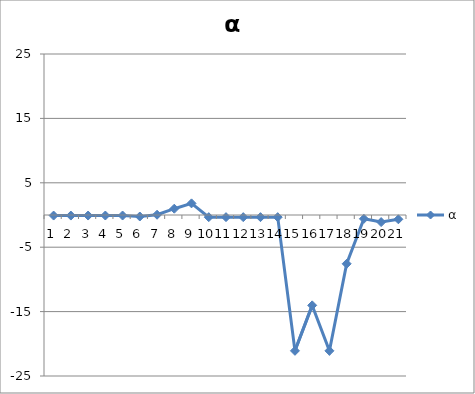
| Category | α |
|---|---|
| 0 | -0.087 |
| 1 | -0.088 |
| 2 | -0.083 |
| 3 | -0.082 |
| 4 | -0.082 |
| 5 | -0.235 |
| 6 | 0.041 |
| 7 | 0.977 |
| 8 | 1.807 |
| 9 | -0.333 |
| 10 | -0.333 |
| 11 | -0.333 |
| 12 | -0.333 |
| 13 | -0.333 |
| 14 | -21.09 |
| 15 | -14.031 |
| 16 | -21.09 |
| 17 | -7.574 |
| 18 | -0.594 |
| 19 | -1.1 |
| 20 | -0.667 |